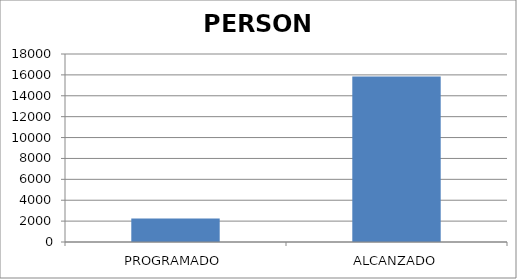
| Category | PERSONA |
|---|---|
| PROGRAMADO | 2258 |
| ALCANZADO | 15835 |